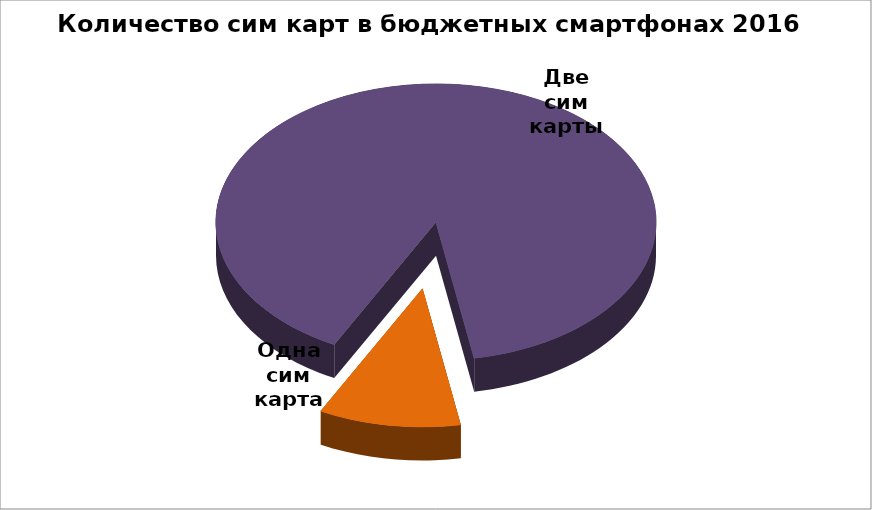
| Category | Series 0 |
|---|---|
| Одна сим карта | 17 |
| Две сим карты | 146 |